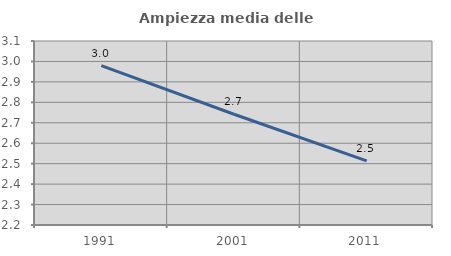
| Category | Ampiezza media delle famiglie |
|---|---|
| 1991.0 | 2.98 |
| 2001.0 | 2.742 |
| 2011.0 | 2.514 |